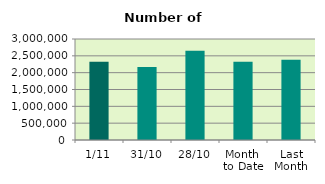
| Category | Series 0 |
|---|---|
| 1/11 | 2324192 |
| 31/10 | 2170898 |
| 28/10 | 2651664 |
| Month 
to Date | 2324192 |
| Last
Month | 2382963.143 |